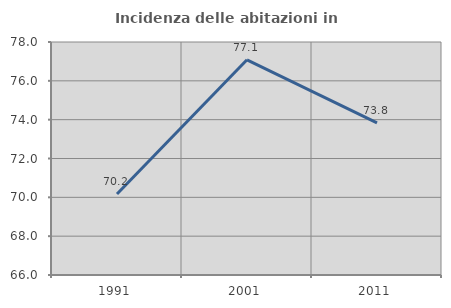
| Category | Incidenza delle abitazioni in proprietà  |
|---|---|
| 1991.0 | 70.175 |
| 2001.0 | 77.083 |
| 2011.0 | 73.832 |